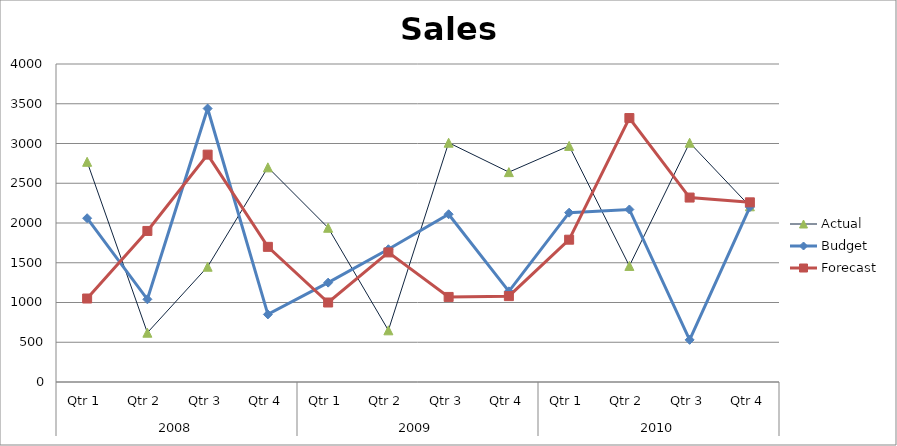
| Category | Actual | Budget | Forecast |
|---|---|---|---|
| 0 | 2770 | 2060 | 1050 |
| 1 | 620 | 1040 | 1900 |
| 2 | 1450 | 3440 | 2860 |
| 3 | 2700 | 850 | 1700 |
| 4 | 1940 | 1250 | 1000 |
| 5 | 650 | 1670 | 1630 |
| 6 | 3010 | 2110 | 1070 |
| 7 | 2640 | 1140 | 1080 |
| 8 | 2970 | 2130 | 1790 |
| 9 | 1460 | 2170 | 3320 |
| 10 | 3010 | 530 | 2320 |
| 11 | 2210 | 2200 | 2260 |